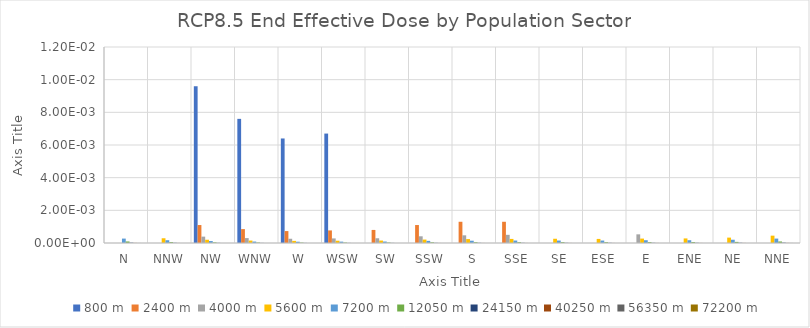
| Category | 800 m | 2400 m | 4000 m | 5600 m | 7200 m | 12050 m | 24150 m | 40250 m | 56350 m | 72200 m |
|---|---|---|---|---|---|---|---|---|---|---|
| N | 0 | 0 | 0 | 0 | 0 | 0 | 0 | 0 | 0 | 0 |
| NNW | 0 | 0 | 0 | 0 | 0 | 0 | 0 | 0 | 0 | 0 |
| NW | 0.01 | 0.001 | 0 | 0 | 0 | 0 | 0 | 0 | 0 | 0 |
| WNW | 0.008 | 0.001 | 0 | 0 | 0 | 0 | 0 | 0 | 0 | 0 |
| W | 0.006 | 0.001 | 0 | 0 | 0 | 0 | 0 | 0 | 0 | 0 |
| WSW | 0.007 | 0.001 | 0 | 0 | 0 | 0 | 0 | 0 | 0 | 0 |
| SW | 0 | 0.001 | 0 | 0 | 0 | 0 | 0 | 0 | 0 | 0 |
| SSW | 0 | 0.001 | 0 | 0 | 0 | 0 | 0 | 0 | 0 | 0 |
| S | 0 | 0.001 | 0 | 0 | 0 | 0 | 0 | 0 | 0 | 0 |
| SSE | 0 | 0.001 | 0 | 0 | 0 | 0 | 0 | 0 | 0 | 0 |
| SE | 0 | 0 | 0 | 0 | 0 | 0 | 0 | 0 | 0 | 0 |
| ESE | 0 | 0 | 0 | 0 | 0 | 0 | 0 | 0 | 0 | 0 |
| E | 0 | 0 | 0.001 | 0 | 0 | 0 | 0 | 0 | 0 | 0 |
| ENE | 0 | 0 | 0 | 0 | 0 | 0 | 0 | 0 | 0 | 0 |
| NE | 0 | 0 | 0 | 0 | 0 | 0 | 0 | 0 | 0 | 0 |
| NNE | 0 | 0 | 0 | 0 | 0 | 0 | 0 | 0 | 0 | 0 |